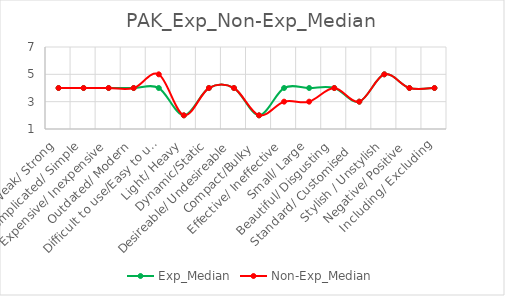
| Category | Exp_Median | Non-Exp_Median |
|---|---|---|
| Weak/ Strong | 4 | 4 |
| Complicated/ Simple | 4 | 4 |
| Expensive/ Inexpensive | 4 | 4 |
| Outdated/ Modern | 4 | 4 |
| Difficult to use/Easy to use | 4 | 5 |
| Light/ Heavy | 2 | 2 |
| Dynamic/Static | 4 | 4 |
| Desireable/ Undesireable | 4 | 4 |
| Compact/Bulky  | 2 | 2 |
| Effective/ Ineffective | 4 | 3 |
| Small/ Large | 4 | 3 |
| Beautiful/ Disgusting | 4 | 4 |
| Standard/ Customised   | 3 | 3 |
| Stylish / Unstylish | 5 | 5 |
| Negative/ Positive | 4 | 4 |
| Including/ Excluding | 4 | 4 |